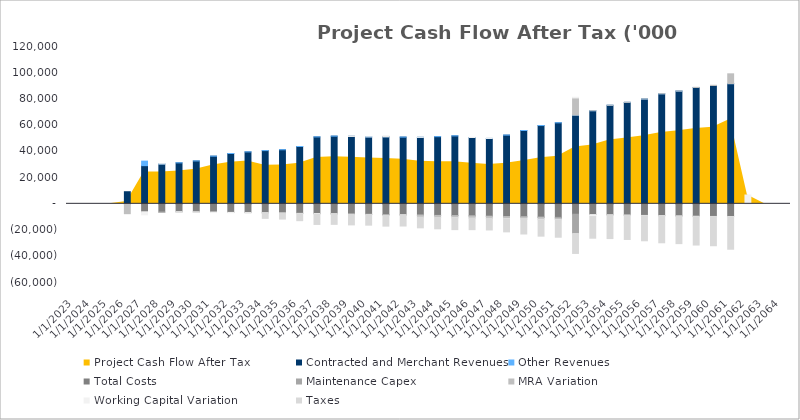
| Category | Contracted and Merchant Revenues | Other Revenues | Total Costs | Maintenance Capex | MRA Variation | Working Capital Variation | Taxes |
|---|---|---|---|---|---|---|---|
| 12/31/23 | 0 | 0 | 0 | 0 | 0 | 0 | 0 |
| 12/31/24 | 0 | 0 | 0 | 0 | 0 | 0 | 0 |
| 12/31/25 | 0 | 0 | 0 | 0 | 0 | 0 | 0 |
| 12/31/26 | 9238.314 | 0 | 0 | 0 | -7509.882 | 0 | 0 |
| 12/31/27 | 29109.556 | 3465.475 | -6166.569 | 0 | -9.248 | -2170.559 | 0 |
| 12/31/28 | 30440.482 | 0 | -6355.513 | 0 | -18.728 | 196.381 | 0 |
| 12/31/29 | 31265.539 | 0 | -6069.03 | 0 | -28.445 | -96.768 | 0 |
| 12/31/30 | 32722.912 | 0 | -6162.74 | 0 | -47.545 | -112.082 | 0 |
| 12/31/31 | 36346.752 | 0 | -6311.91 | 0 | -57.753 | -285.589 | 0 |
| 12/31/32 | 38384.477 | 0 | -6488.464 | 0 | -116.235 | -145.81 | 0 |
| 12/31/33 | 39605.767 | 0 | -6636.023 | 0 | -126.961 | -95.415 | 0 |
| 12/31/34 | 40603.276 | 0 | -6803.578 | 0 | -137.954 | -68.215 | -4071.704 |
| 12/31/35 | 41243.989 | 0 | -6992.134 | 0 | -149.222 | -37.164 | -4442.027 |
| 12/31/36 | 43715.379 | 0 | -7207.446 | -92.484 | -68.289 | -169.652 | -5310.798 |
| 12/31/37 | 51041.68 | 0 | -7366.503 | -94.796 | -68.567 | -597.076 | -7579.544 |
| 12/31/38 | 51624.501 | 0 | -7549.94 | -97.166 | -68.852 | -32.631 | -7907.044 |
| 12/31/39 | 51465.058 | 0 | -7737.641 | -191.004 | 22.265 | 36.245 | -8124.231 |
| 12/31/40 | 51071.262 | 0 | -7955.7 | -102.085 | -60.303 | 52.64 | -8139.843 |
| 12/31/41 | 51058.254 | 0 | -8140.362 | -584.82 | 419.573 | 46.264 | -8280.658 |
| 12/31/42 | 50891.896 | 0 | -8343.722 | -107.253 | -74.374 | -8.864 | -8394.126 |
| 12/31/43 | 50708.65 | 0 | -8548.467 | -109.934 | -1532.111 | 32.11 | -8113.73 |
| 12/31/44 | 51232.35 | 0 | -8785.388 | -112.682 | -1532.442 | -13.838 | -8596.581 |
| 12/31/45 | 51824.812 | 0 | -8980.075 | -115.499 | -1532.781 | -41.969 | -8990.3 |
| 12/31/46 | 50594.831 | 0 | -9206.297 | -118.387 | -1533.128 | 119.925 | -8828.704 |
| 12/31/47 | 49872.472 | 0 | -9432.253 | -121.347 | -1533.484 | 78.187 | -8839.24 |
| 12/31/48 | 52404.912 | 0 | -9687.428 | -124.38 | -1533.849 | -177.358 | -9844.275 |
| 12/31/49 | 55923.542 | 0 | -9904.902 | -127.49 | -1534.224 | -280.637 | -11163.282 |
| 12/31/50 | 59710.808 | 0 | -10155.25 | -130.677 | -1534.607 | -290.444 | -12545.832 |
| 12/31/51 | 61807.05 | 0 | -10326.504 | -748.62 | -920.325 | -107.428 | -13361.522 |
| 12/31/52 | 67655.333 | 0 | -7934.597 | -14711.435 | 13117.352 | 480.46 | -15180.409 |
| 12/31/53 | 71027.494 | 0 | -8111.704 | -140.725 | 17.786 | -1470.307 | -16490.286 |
| 12/31/54 | 75155.611 | 0 | -8314.891 | -144.243 | 35.377 | -322.308 | -17702.344 |
| 12/31/55 | 77388.817 | 0 | -8518.161 | -147.849 | 53.407 | -166.548 | -18349.036 |
| 12/31/56 | 79963.891 | 0 | -8753.776 | -151.545 | 71.888 | -176.023 | -19092.332 |
| 12/31/57 | 83939.927 | 0 | -8950.811 | -155.334 | 90.831 | -326.249 | -20266.515 |
| 12/31/58 | 86016.438 | 0 | -9174.673 | -159.217 | 110.248 | -151.953 | -20866.709 |
| 12/31/59 | 88725.791 | 0 | -9400.393 | -163.198 | 130.15 | -203.807 | -21658.689 |
| 12/31/60 | 90269.883 | 0 | -9565.824 | -167.278 | 150.55 | -94.893 | -22123.628 |
| 12/31/61 | 91654.973 | 0 | -9686.855 | 0 | 7509.882 | -135.73 | -24806.405 |
| 12/31/62 | 0 | 0 | 0 | 0 | 0 | 6737.106 | 0 |
| 12/31/63 | 0 | 0 | 0 | 0 | 0 | 0 | 0 |
| 12/31/64 | 0 | 0 | 0 | 0 | 0 | 0 | 0 |
| 12/31/65 | 0 | 0 | 0 | 0 | 0 | 0 | 0 |
| 12/31/66 | 0 | 0 | 0 | 0 | 0 | 0 | 0 |
| 12/31/67 | 0 | 0 | 0 | 0 | 0 | 0 | 0 |
| 12/31/68 | 0 | 0 | 0 | 0 | 0 | 0 | 0 |
| 12/31/69 | 0 | 0 | 0 | 0 | 0 | 0 | 0 |
| 12/31/70 | 0 | 0 | 0 | 0 | 0 | 0 | 0 |
| 12/31/71 | 0 | 0 | 0 | 0 | 0 | 0 | 0 |
| 12/31/72 | 0 | 0 | 0 | 0 | 0 | 0 | 0 |
| 12/31/73 | 0 | 0 | 0 | 0 | 0 | 0 | 0 |
| 12/31/74 | 0 | 0 | 0 | 0 | 0 | 0 | 0 |
| 12/31/75 | 0 | 0 | 0 | 0 | 0 | 0 | 0 |
| 12/31/76 | 0 | 0 | 0 | 0 | 0 | 0 | 0 |
| 12/31/77 | 0 | 0 | 0 | 0 | 0 | 0 | 0 |
| 12/31/78 | 0 | 0 | 0 | 0 | 0 | 0 | 0 |
| 12/31/79 | 0 | 0 | 0 | 0 | 0 | 0 | 0 |
| 12/31/80 | 0 | 0 | 0 | 0 | 0 | 0 | 0 |
| 12/31/81 | 0 | 0 | 0 | 0 | 0 | 0 | 0 |
| 12/31/82 | 0 | 0 | 0 | 0 | 0 | 0 | 0 |